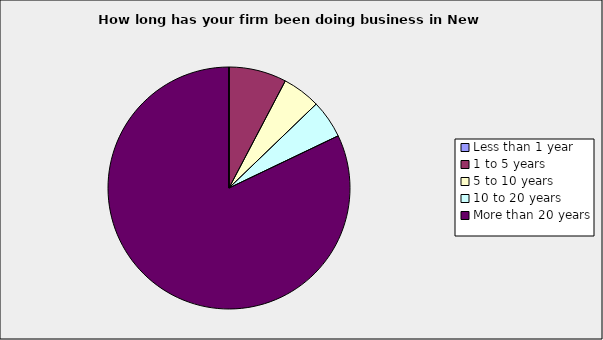
| Category | Series 0 |
|---|---|
| Less than 1 year | 0 |
| 1 to 5 years | 0.077 |
| 5 to 10 years | 0.051 |
| 10 to 20 years | 0.051 |
| More than 20 years | 0.821 |